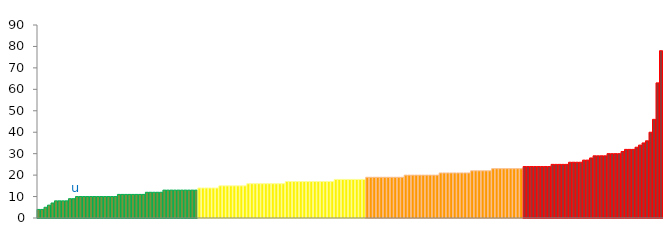
| Category | Top Quartile | 2nd Quartile | 3rd Quartile | Bottom Quartile | Series 4 |
|---|---|---|---|---|---|
|  | 4 | 0 | 0 | 0 | 4 |
|  | 4 | 0 | 0 | 0 | 4 |
|  | 5 | 0 | 0 | 0 | 5 |
|  | 6 | 0 | 0 | 0 | 6 |
|  | 7 | 0 | 0 | 0 | 7 |
|  | 8 | 0 | 0 | 0 | 8 |
|  | 8 | 0 | 0 | 0 | 8 |
|  | 8 | 0 | 0 | 0 | 8 |
|  | 8 | 0 | 0 | 0 | 8 |
|  | 9 | 0 | 0 | 0 | 9 |
|  | 9 | 0 | 0 | 0 | 9 |
| u | 10 | 0 | 0 | 0 | 10 |